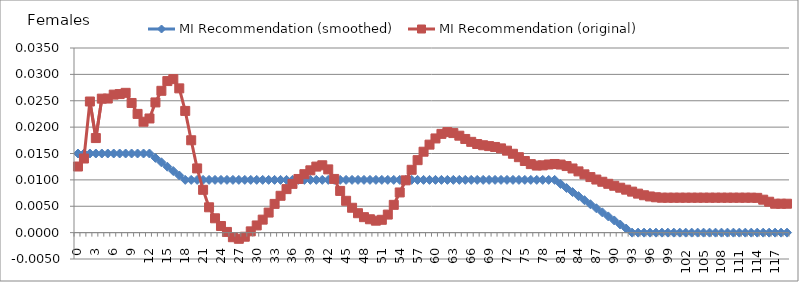
| Category | MI Recommendation (smoothed) | MI Recommendation (original)  |
|---|---|---|
| 0.0 | 0.015 | 0.013 |
| 1.0 | 0.015 | 0.014 |
| 2.0 | 0.015 | 0.025 |
| 3.0 | 0.015 | 0.018 |
| 4.0 | 0.015 | 0.025 |
| 5.0 | 0.015 | 0.025 |
| 6.0 | 0.015 | 0.026 |
| 7.0 | 0.015 | 0.026 |
| 8.0 | 0.015 | 0.027 |
| 9.0 | 0.015 | 0.025 |
| 10.0 | 0.015 | 0.023 |
| 11.0 | 0.015 | 0.021 |
| 12.0 | 0.015 | 0.022 |
| 13.0 | 0.014 | 0.025 |
| 14.0 | 0.013 | 0.027 |
| 15.0 | 0.012 | 0.029 |
| 16.0 | 0.012 | 0.029 |
| 17.0 | 0.011 | 0.027 |
| 18.0 | 0.01 | 0.023 |
| 19.0 | 0.01 | 0.018 |
| 20.0 | 0.01 | 0.012 |
| 21.0 | 0.01 | 0.008 |
| 22.0 | 0.01 | 0.005 |
| 23.0 | 0.01 | 0.003 |
| 24.0 | 0.01 | 0.001 |
| 25.0 | 0.01 | 0 |
| 26.0 | 0.01 | -0.001 |
| 27.0 | 0.01 | -0.001 |
| 28.0 | 0.01 | -0.001 |
| 29.0 | 0.01 | 0 |
| 30.0 | 0.01 | 0.001 |
| 31.0 | 0.01 | 0.002 |
| 32.0 | 0.01 | 0.004 |
| 33.0 | 0.01 | 0.005 |
| 34.0 | 0.01 | 0.007 |
| 35.0 | 0.01 | 0.008 |
| 36.0 | 0.01 | 0.009 |
| 37.0 | 0.01 | 0.01 |
| 38.0 | 0.01 | 0.011 |
| 39.0 | 0.01 | 0.012 |
| 40.0 | 0.01 | 0.013 |
| 41.0 | 0.01 | 0.013 |
| 42.0 | 0.01 | 0.012 |
| 43.0 | 0.01 | 0.01 |
| 44.0 | 0.01 | 0.008 |
| 45.0 | 0.01 | 0.006 |
| 46.0 | 0.01 | 0.005 |
| 47.0 | 0.01 | 0.004 |
| 48.0 | 0.01 | 0.003 |
| 49.0 | 0.01 | 0.003 |
| 50.0 | 0.01 | 0.002 |
| 51.0 | 0.01 | 0.002 |
| 52.0 | 0.01 | 0.003 |
| 53.0 | 0.01 | 0.005 |
| 54.0 | 0.01 | 0.008 |
| 55.0 | 0.01 | 0.01 |
| 56.0 | 0.01 | 0.012 |
| 57.0 | 0.01 | 0.014 |
| 58.0 | 0.01 | 0.015 |
| 59.0 | 0.01 | 0.017 |
| 60.0 | 0.01 | 0.018 |
| 61.0 | 0.01 | 0.019 |
| 62.0 | 0.01 | 0.019 |
| 63.0 | 0.01 | 0.019 |
| 64.0 | 0.01 | 0.018 |
| 65.0 | 0.01 | 0.018 |
| 66.0 | 0.01 | 0.017 |
| 67.0 | 0.01 | 0.017 |
| 68.0 | 0.01 | 0.017 |
| 69.0 | 0.01 | 0.016 |
| 70.0 | 0.01 | 0.016 |
| 71.0 | 0.01 | 0.016 |
| 72.0 | 0.01 | 0.016 |
| 73.0 | 0.01 | 0.015 |
| 74.0 | 0.01 | 0.014 |
| 75.0 | 0.01 | 0.014 |
| 76.0 | 0.01 | 0.013 |
| 77.0 | 0.01 | 0.013 |
| 78.0 | 0.01 | 0.013 |
| 79.0 | 0.01 | 0.013 |
| 80.0 | 0.01 | 0.013 |
| 81.0 | 0.009 | 0.013 |
| 82.0 | 0.008 | 0.013 |
| 83.0 | 0.008 | 0.012 |
| 84.0 | 0.007 | 0.012 |
| 85.0 | 0.006 | 0.011 |
| 86.0 | 0.005 | 0.011 |
| 87.0 | 0.005 | 0.01 |
| 88.0 | 0.004 | 0.01 |
| 89.0 | 0.003 | 0.009 |
| 90.0 | 0.002 | 0.009 |
| 91.0 | 0.002 | 0.009 |
| 92.0 | 0.001 | 0.008 |
| 93.0 | 0 | 0.008 |
| 94.0 | 0 | 0.007 |
| 95.0 | 0 | 0.007 |
| 96.0 | 0 | 0.007 |
| 97.0 | 0 | 0.007 |
| 98.0 | 0 | 0.007 |
| 99.0 | 0 | 0.007 |
| 100.0 | 0 | 0.007 |
| 101.0 | 0 | 0.007 |
| 102.0 | 0 | 0.007 |
| 103.0 | 0 | 0.007 |
| 104.0 | 0 | 0.007 |
| 105.0 | 0 | 0.007 |
| 106.0 | 0 | 0.007 |
| 107.0 | 0 | 0.007 |
| 108.0 | 0 | 0.007 |
| 109.0 | 0 | 0.007 |
| 110.0 | 0 | 0.007 |
| 111.0 | 0 | 0.007 |
| 112.0 | 0 | 0.007 |
| 113.0 | 0 | 0.007 |
| 114.0 | 0 | 0.007 |
| 115.0 | 0 | 0.006 |
| 116.0 | 0 | 0.006 |
| 117.0 | 0 | 0.005 |
| 118.0 | 0 | 0.005 |
| 119.0 | 0 | 0.005 |